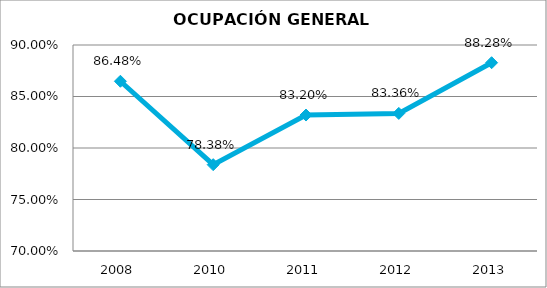
| Category | Series 0 |
|---|---|
| 2008.0 | 0.865 |
| 2010.0 | 0.784 |
| 2011.0 | 0.832 |
| 2012.0 | 0.834 |
| 2013.0 | 0.883 |